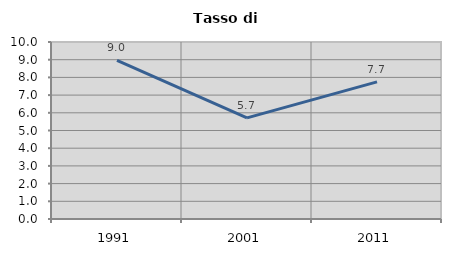
| Category | Tasso di disoccupazione   |
|---|---|
| 1991.0 | 8.966 |
| 2001.0 | 5.713 |
| 2011.0 | 7.745 |